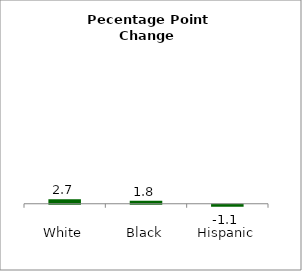
| Category | Series 0 |
|---|---|
| White | 2.691 |
| Black | 1.764 |
| Hispanic | -1.137 |